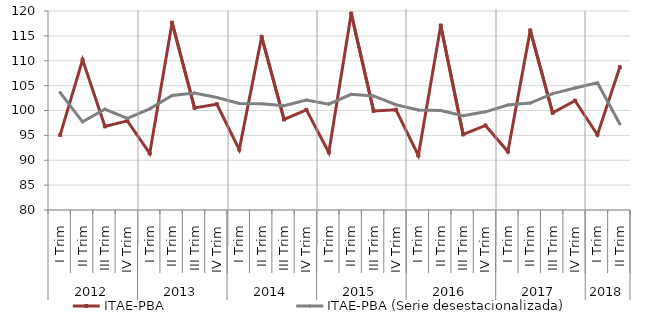
| Category | ITAE-PBA | ITAE-PBA (Serie desestacionalizada) |
|---|---|---|
| 0 | 95.089 | 103.61 |
| 1 | 110.192 | 97.731 |
| 2 | 96.803 | 100.252 |
| 3 | 97.916 | 98.407 |
| 4 | 91.378 | 100.33 |
| 5 | 117.669 | 103.001 |
| 6 | 100.518 | 103.511 |
| 7 | 101.252 | 102.619 |
| 8 | 92.143 | 101.407 |
| 9 | 114.82 | 101.359 |
| 10 | 98.199 | 100.98 |
| 11 | 100.119 | 102.102 |
| 12 | 91.557 | 101.272 |
| 13 | 119.507 | 103.249 |
| 14 | 99.924 | 102.927 |
| 15 | 100.157 | 101.166 |
| 16 | 90.97 | 100.106 |
| 17 | 117.09 | 100.016 |
| 18 | 95.191 | 98.941 |
| 19 | 97 | 99.732 |
| 20 | 91.746 | 101.109 |
| 21 | 116.109 | 101.489 |
| 22 | 99.531 | 103.384 |
| 23 | 101.973 | 104.529 |
| 24 | 95.135 | 105.566 |
| 25 | 108.699 | 97.304 |